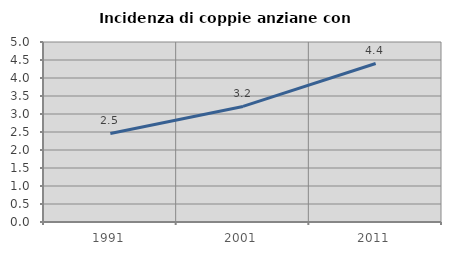
| Category | Incidenza di coppie anziane con figli |
|---|---|
| 1991.0 | 2.459 |
| 2001.0 | 3.21 |
| 2011.0 | 4.403 |